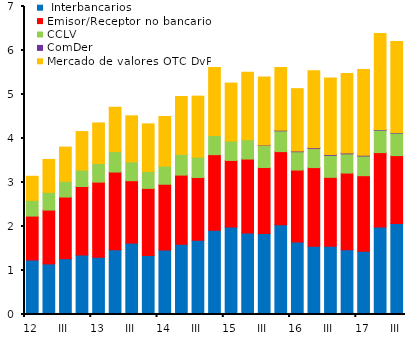
| Category |  Interbancarios | Emisor/Receptor no bancario | CCLV | ComDer | Mercado de valores OTC DvP |
|---|---|---|---|---|---|
| 12 | 1.239 | 0.998 | 0.357 | 0 | 0.547 |
| II | 1.15 | 1.223 | 0.403 | 0 | 0.748 |
| III | 1.269 | 1.401 | 0.358 | 0 | 0.778 |
| IV | 1.354 | 1.556 | 0.372 | 0 | 0.876 |
| 13 | 1.303 | 1.706 | 0.422 | 0 | 0.923 |
| II | 1.47 | 1.768 | 0.464 | 0 | 1.008 |
| III | 1.623 | 1.418 | 0.428 | 0 | 1.046 |
| IV | 1.339 | 1.527 | 0.387 | 0 | 1.079 |
| 14 | 1.466 | 1.495 | 0.413 | 0 | 1.127 |
| II | 1.598 | 1.571 | 0.472 | 0 | 1.315 |
| III | 1.687 | 1.428 | 0.462 | 0 | 1.386 |
| IV | 1.912 | 1.721 | 0.434 | 0 | 1.545 |
| 15 | 1.989 | 1.512 | 0.441 | 0 | 1.317 |
| II | 1.852 | 1.681 | 0.441 | 0 | 1.529 |
| III | 1.84 | 1.501 | 0.503 | 0.006 | 1.549 |
| IV | 2.038 | 1.663 | 0.472 | 0.014 | 1.425 |
| 16 | 1.649 | 1.634 | 0.416 | 0.016 | 1.417 |
| II | 1.55 | 1.789 | 0.432 | 0.016 | 1.755 |
| III | 1.549 | 1.569 | 0.501 | 0.018 | 1.74 |
| IV | 1.472 | 1.743 | 0.437 | 0.02 | 1.807 |
| 17 | 1.437 | 1.717 | 0.448 | 0.017 | 1.949 |
| II | 1.986 | 1.693 | 0.511 | 0.013 | 2.18 |
| III | 2.07 | 1.541 | 0.513 | 0.015 | 2.063 |